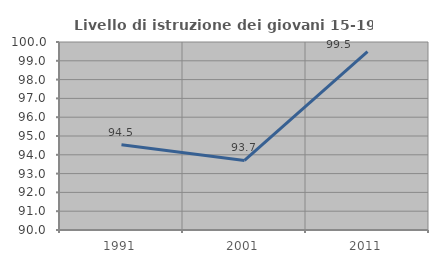
| Category | Livello di istruzione dei giovani 15-19 anni |
|---|---|
| 1991.0 | 94.537 |
| 2001.0 | 93.701 |
| 2011.0 | 99.492 |